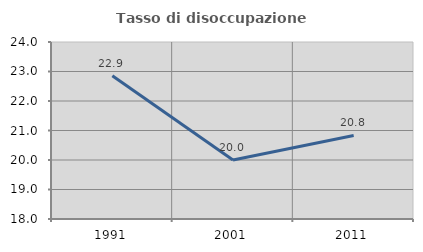
| Category | Tasso di disoccupazione giovanile  |
|---|---|
| 1991.0 | 22.857 |
| 2001.0 | 20 |
| 2011.0 | 20.833 |